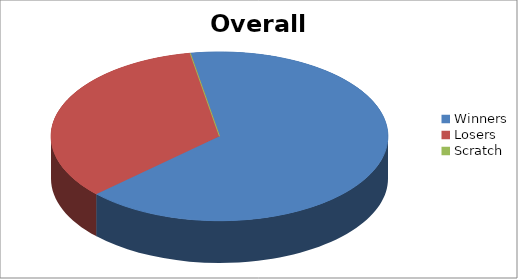
| Category | Series 1 |
|---|---|
| Winners | 25 |
| Losers | 13 |
| Scratch | 0 |